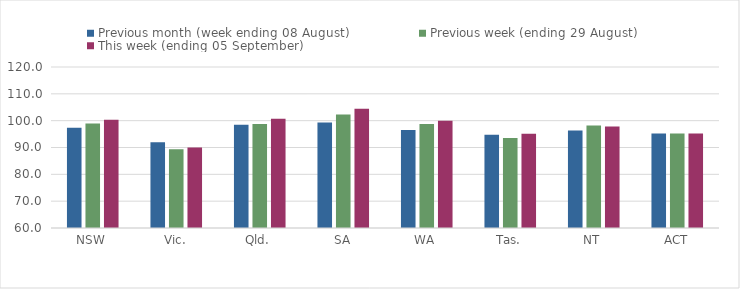
| Category | Previous month (week ending 08 August) | Previous week (ending 29 August) | This week (ending 05 September) |
|---|---|---|---|
| NSW | 97.37 | 98.92 | 100.32 |
| Vic. | 91.92 | 89.34 | 89.96 |
| Qld. | 98.48 | 98.78 | 100.7 |
| SA | 99.28 | 102.29 | 104.48 |
| WA | 96.52 | 98.76 | 99.97 |
| Tas. | 94.79 | 93.57 | 95.16 |
| NT | 96.36 | 98.21 | 97.82 |
| ACT | 95.26 | 95.26 | 95.26 |